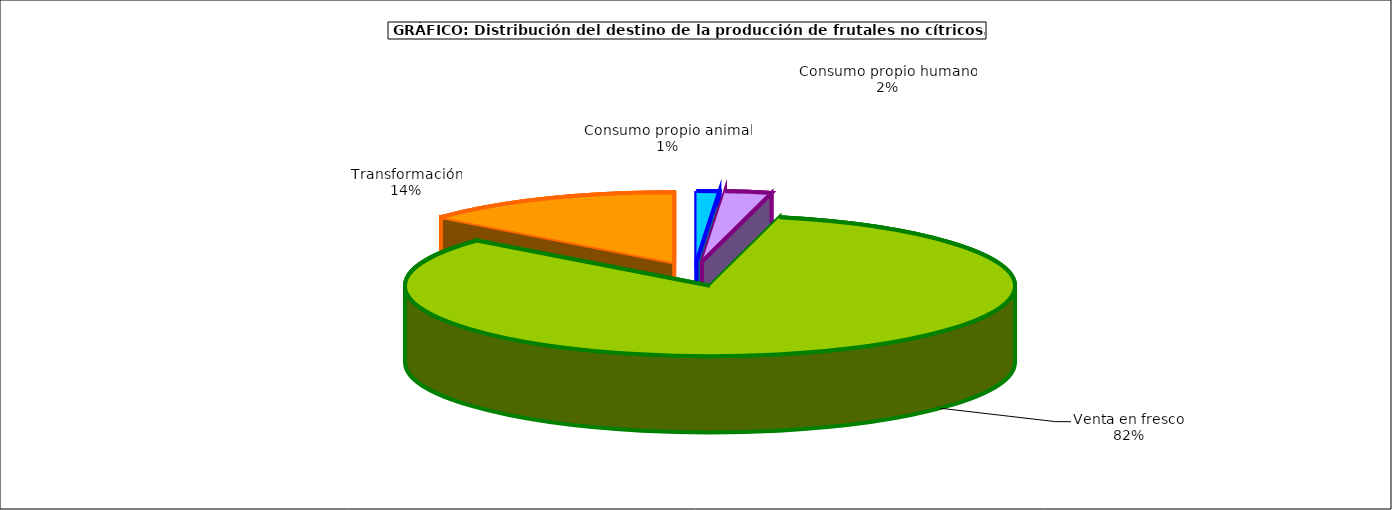
| Category | frutales no cítricos |
|---|---|
| 0 | 57968 |
| 1 | 119039 |
| 2 | 3993467 |
| 3 | 670348 |